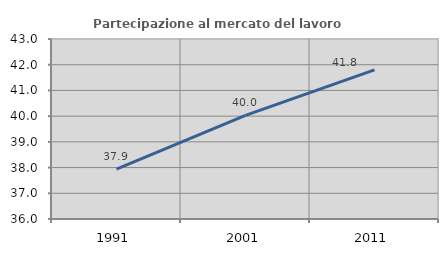
| Category | Partecipazione al mercato del lavoro  femminile |
|---|---|
| 1991.0 | 37.941 |
| 2001.0 | 40.028 |
| 2011.0 | 41.801 |